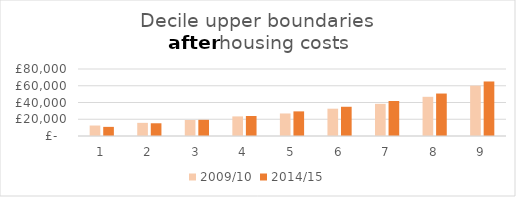
| Category | 2009/10 | 2014/15 |
|---|---|---|
| 0 | 12500 | 10900 |
| 1 | 15700 | 15200 |
| 2 | 19100 | 19300 |
| 3 | 23400 | 23900 |
| 4 | 26900 | 29400 |
| 5 | 32600 | 34900 |
| 6 | 38400 | 41800 |
| 7 | 46800 | 50700 |
| 8 | 60100 | 65100 |